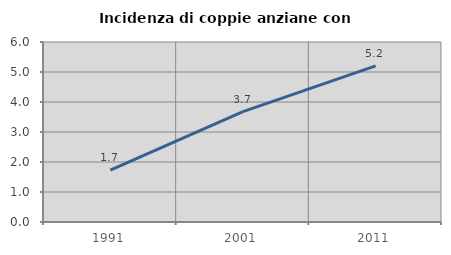
| Category | Incidenza di coppie anziane con figli |
|---|---|
| 1991.0 | 1.729 |
| 2001.0 | 3.681 |
| 2011.0 | 5.202 |